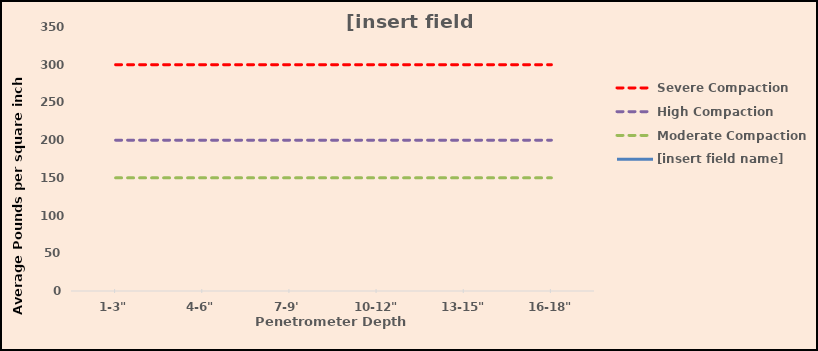
| Category | Severe Compaction | High Compaction | Moderate Compaction | [insert field name] |
|---|---|---|---|---|
| 1-3" | 300 | 200 | 150 |  |
| 4-6" | 300 | 200 | 150 |  |
| 7-9' | 300 | 200 | 150 |  |
| 10-12" | 300 | 200 | 150 |  |
| 13-15" | 300 | 200 | 150 |  |
| 16-18" | 300 | 200 | 150 |  |